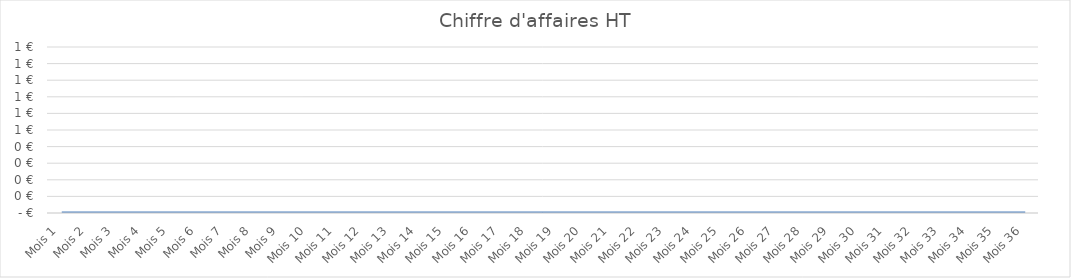
| Category | Chiffre d'affaires HT |
|---|---|
| Mois 1 | 0 |
| Mois 2 | 0 |
| Mois 3 | 0 |
| Mois 4 | 0 |
| Mois 5 | 0 |
| Mois 6 | 0 |
| Mois 7 | 0 |
| Mois 8 | 0 |
| Mois 9 | 0 |
| Mois 10 | 0 |
| Mois 11 | 0 |
| Mois 12 | 0 |
| Mois 13 | 0 |
| Mois 14 | 0 |
| Mois 15 | 0 |
| Mois 16 | 0 |
| Mois 17 | 0 |
| Mois 18 | 0 |
| Mois 19 | 0 |
| Mois 20 | 0 |
| Mois 21 | 0 |
| Mois 22 | 0 |
| Mois 23 | 0 |
| Mois 24 | 0 |
| Mois 25 | 0 |
| Mois 26 | 0 |
| Mois 27 | 0 |
| Mois 28 | 0 |
| Mois 29 | 0 |
| Mois 30 | 0 |
| Mois 31 | 0 |
| Mois 32 | 0 |
| Mois 33 | 0 |
| Mois 34 | 0 |
| Mois 35 | 0 |
| Mois 36 | 0 |